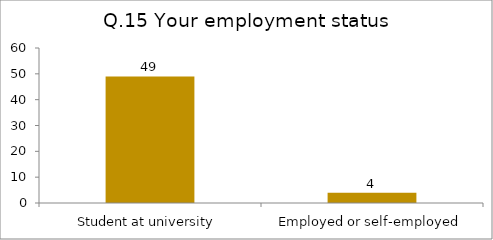
| Category | Q.15 Your employment status |
|---|---|
| Student at university | 49 |
| Employed or self-employed | 4 |